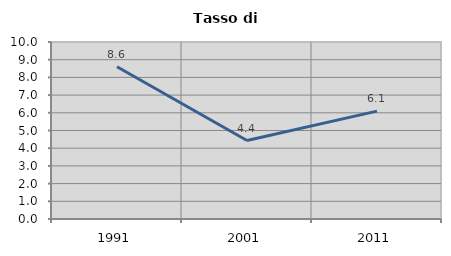
| Category | Tasso di disoccupazione   |
|---|---|
| 1991.0 | 8.602 |
| 2001.0 | 4.434 |
| 2011.0 | 6.095 |